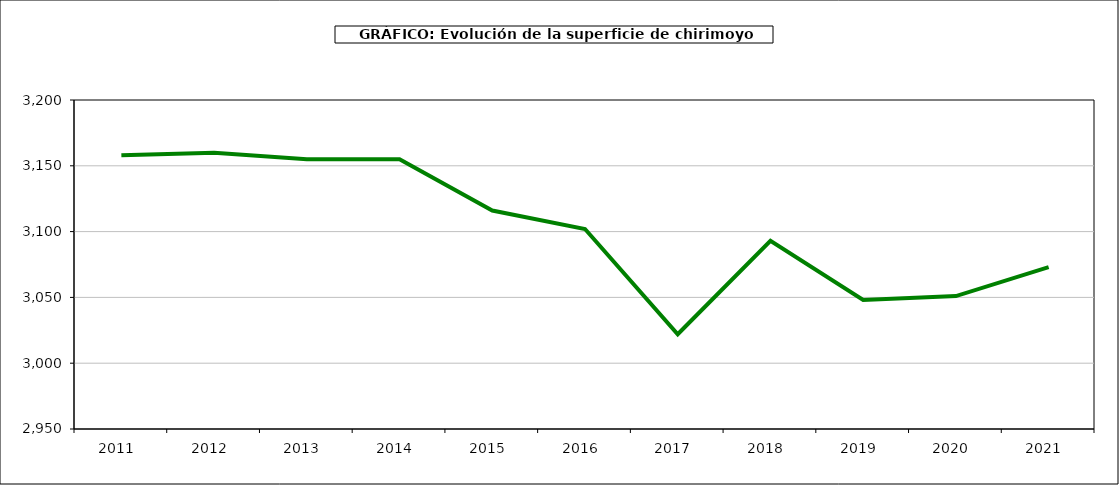
| Category | superficie chirimoyo |
|---|---|
| 2011.0 | 3158 |
| 2012.0 | 3160 |
| 2013.0 | 3155 |
| 2014.0 | 3155 |
| 2015.0 | 3116 |
| 2016.0 | 3102 |
| 2017.0 | 3022 |
| 2018.0 | 3093 |
| 2019.0 | 3048 |
| 2020.0 | 3051 |
| 2021.0 | 3073 |